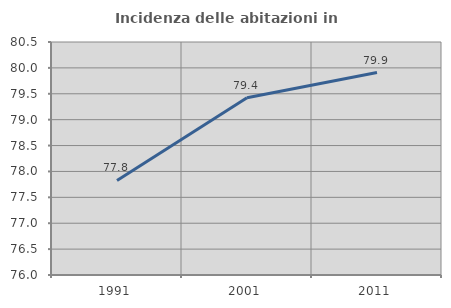
| Category | Incidenza delle abitazioni in proprietà  |
|---|---|
| 1991.0 | 77.825 |
| 2001.0 | 79.422 |
| 2011.0 | 79.91 |